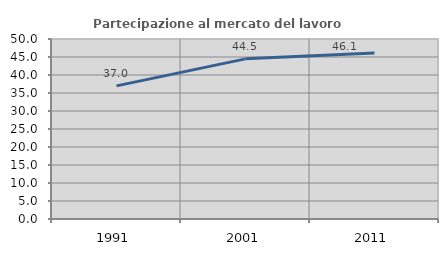
| Category | Partecipazione al mercato del lavoro  femminile |
|---|---|
| 1991.0 | 36.981 |
| 2001.0 | 44.482 |
| 2011.0 | 46.108 |